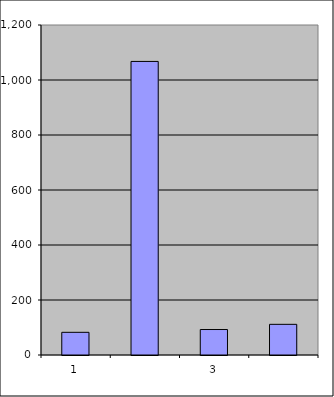
| Category | Series 0 |
|---|---|
| 0 | 82.5 |
| 1 | 1067.536 |
| 2 | 92.617 |
| 3 | 111.5 |